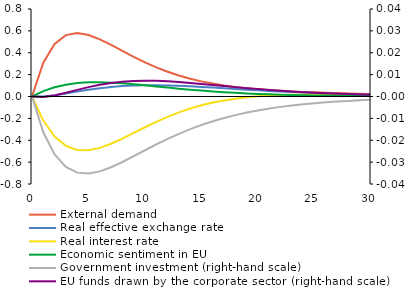
| Category | External demand | Real effective exchange rate | Real interest rate | Economic sentiment in EU |
|---|---|---|---|---|
| 0.0 | 0 | 0 | 0 | 0 |
| 1.0 | 0.309 | 0.001 | -0.22 | 0.049 |
| 2.0 | 0.481 | 0.012 | -0.366 | 0.084 |
| 3.0 | 0.561 | 0.028 | -0.451 | 0.108 |
| 4.0 | 0.581 | 0.045 | -0.489 | 0.123 |
| 5.0 | 0.562 | 0.061 | -0.492 | 0.129 |
| 6.0 | 0.522 | 0.076 | -0.47 | 0.13 |
| 7.0 | 0.471 | 0.087 | -0.432 | 0.127 |
| 8.0 | 0.416 | 0.095 | -0.385 | 0.12 |
| 9.0 | 0.362 | 0.1 | -0.333 | 0.112 |
| 10.0 | 0.312 | 0.103 | -0.281 | 0.102 |
| 11.0 | 0.266 | 0.103 | -0.232 | 0.092 |
| 12.0 | 0.226 | 0.101 | -0.186 | 0.082 |
| 13.0 | 0.192 | 0.098 | -0.146 | 0.072 |
| 14.0 | 0.163 | 0.093 | -0.11 | 0.062 |
| 15.0 | 0.138 | 0.088 | -0.08 | 0.054 |
| 16.0 | 0.118 | 0.081 | -0.056 | 0.046 |
| 17.0 | 0.101 | 0.075 | -0.036 | 0.039 |
| 18.0 | 0.087 | 0.069 | -0.02 | 0.033 |
| 19.0 | 0.076 | 0.063 | -0.008 | 0.028 |
| 20.0 | 0.067 | 0.057 | 0.001 | 0.024 |
| 21.0 | 0.059 | 0.051 | 0.008 | 0.02 |
| 22.0 | 0.052 | 0.045 | 0.012 | 0.017 |
| 23.0 | 0.047 | 0.04 | 0.015 | 0.014 |
| 24.0 | 0.042 | 0.036 | 0.016 | 0.012 |
| 25.0 | 0.038 | 0.032 | 0.017 | 0.01 |
| 26.0 | 0.034 | 0.028 | 0.017 | 0.008 |
| 27.0 | 0.031 | 0.025 | 0.016 | 0.007 |
| 28.0 | 0.028 | 0.022 | 0.015 | 0.006 |
| 29.0 | 0.026 | 0.019 | 0.014 | 0.005 |
| 30.0 | 0.023 | 0.017 | 0.013 | 0.004 |